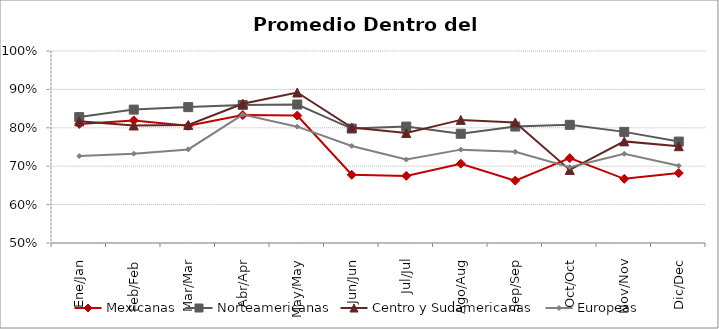
| Category | Mexicanas | Norteamericanas | Centro y Sudamericanas | Europeas |
|---|---|---|---|---|
| Ene/Jan | 0.81 | 0.828 | 0.817 | 0.726 |
| Feb/Feb | 0.819 | 0.847 | 0.806 | 0.733 |
| Mar/Mar | 0.805 | 0.854 | 0.807 | 0.744 |
| Abr/Apr | 0.833 | 0.859 | 0.863 | 0.834 |
| May/May | 0.832 | 0.861 | 0.892 | 0.803 |
| Jun/Jun | 0.678 | 0.798 | 0.801 | 0.753 |
| Jul/Jul | 0.675 | 0.803 | 0.786 | 0.717 |
| Ago/Aug | 0.707 | 0.784 | 0.821 | 0.743 |
| Sep/Sep | 0.662 | 0.803 | 0.814 | 0.738 |
| Oct/Oct | 0.721 | 0.808 | 0.69 | 0.697 |
| Nov/Nov | 0.667 | 0.789 | 0.765 | 0.732 |
| Dic/Dec | 0.682 | 0.764 | 0.752 | 0.701 |